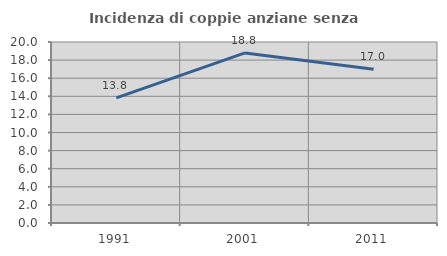
| Category | Incidenza di coppie anziane senza figli  |
|---|---|
| 1991.0 | 13.818 |
| 2001.0 | 18.797 |
| 2011.0 | 16.996 |